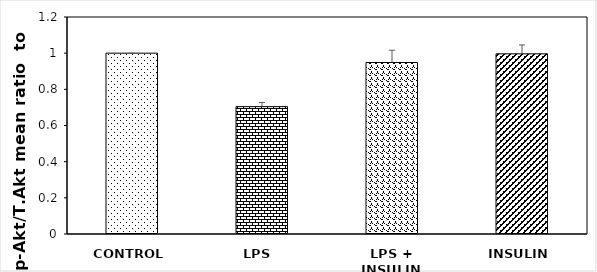
| Category | Series 0 |
|---|---|
| CONTROL | 1 |
| LPS  | 0.704 |
| LPS + INSULIN | 0.948 |
| INSULIN | 0.996 |